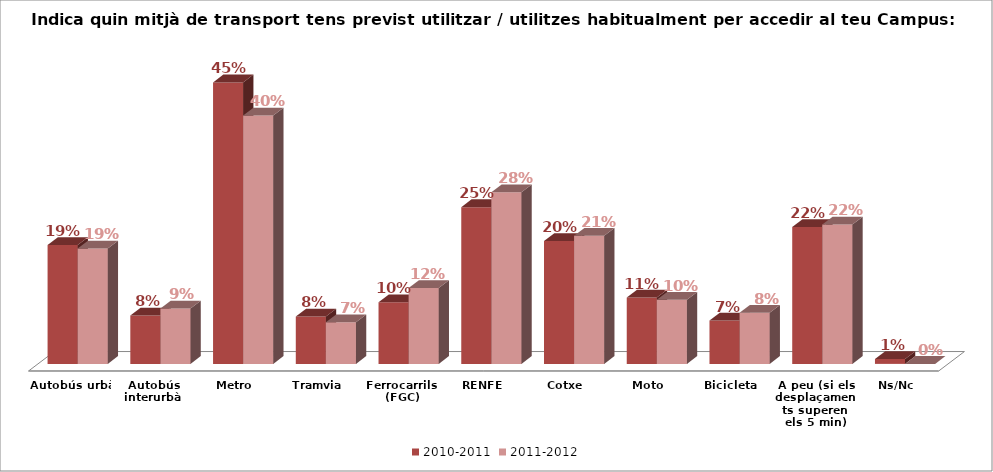
| Category | 2010-2011 | 2011-2012 |
|---|---|---|
| Autobús urbà | 0.191 | 0.185 |
| Autobús interurbà | 0.078 | 0.089 |
| Metro | 0.452 | 0.398 |
| Tramvia | 0.076 | 0.067 |
| Ferrocarrils (FGC) | 0.099 | 0.122 |
| RENFE | 0.252 | 0.276 |
| Cotxe | 0.197 | 0.206 |
| Moto | 0.107 | 0.103 |
| Bicicleta | 0.07 | 0.082 |
| A peu (si els desplaçaments superen els 5 min) | 0.22 | 0.224 |
| Ns/Nc | 0.008 | 0 |